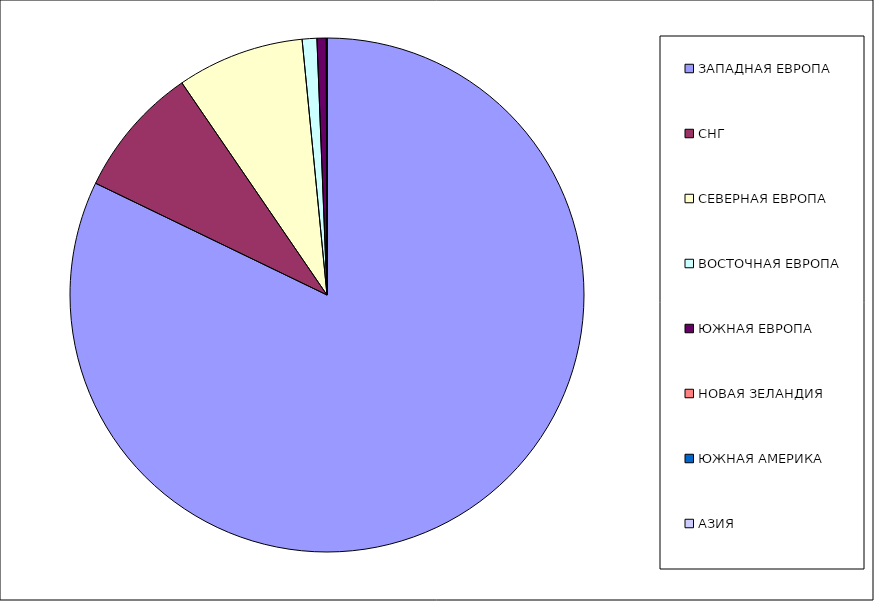
| Category | Оборот |
|---|---|
| ЗАПАДНАЯ ЕВРОПА | 0.822 |
| СНГ | 0.083 |
| СЕВЕРНАЯ ЕВРОПА | 0.08 |
| ВОСТОЧНАЯ ЕВРОПА | 0.009 |
| ЮЖНАЯ ЕВРОПА | 0.006 |
| НОВАЯ ЗЕЛАНДИЯ | 0 |
| ЮЖНАЯ АМЕРИКА | 0 |
| АЗИЯ | 0 |